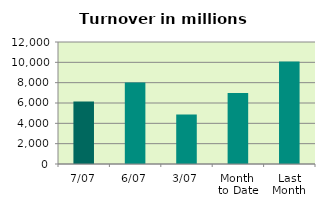
| Category | Series 0 |
|---|---|
| 7/07 | 6151.125 |
| 6/07 | 8016.945 |
| 3/07 | 4867.26 |
| Month 
to Date | 6984.257 |
| Last
Month | 10085.686 |